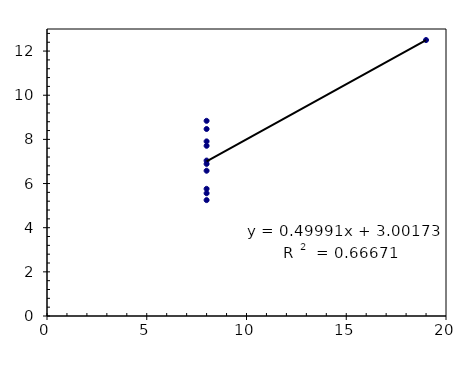
| Category | Series 0 |
|---|---|
| 8.0 | 6.58 |
| 8.0 | 5.76 |
| 8.0 | 7.71 |
| 8.0 | 8.84 |
| 8.0 | 8.47 |
| 8.0 | 7.04 |
| 8.0 | 5.25 |
| 8.0 | 5.56 |
| 8.0 | 7.91 |
| 8.0 | 6.89 |
| 19.0 | 12.5 |